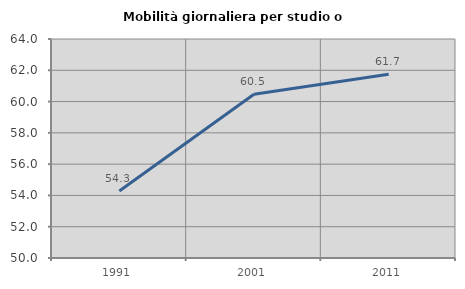
| Category | Mobilità giornaliera per studio o lavoro |
|---|---|
| 1991.0 | 54.286 |
| 2001.0 | 60.465 |
| 2011.0 | 61.749 |